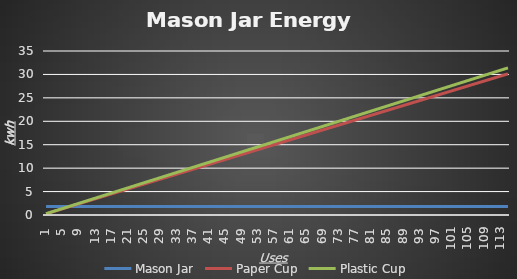
| Category | Mason Jar | Paper Cup | Plastic Cup |
|---|---|---|---|
| 1.0 | 1.81 | 0.262 | 0.273 |
| 2.0 | 1.81 | 0.524 | 0.546 |
| 3.0 | 1.81 | 0.786 | 0.819 |
| 4.0 | 1.81 | 1.048 | 1.092 |
| 5.0 | 1.81 | 1.31 | 1.365 |
| 6.0 | 1.81 | 1.572 | 1.638 |
| 7.0 | 1.81 | 1.834 | 1.911 |
| 8.0 | 1.81 | 2.096 | 2.184 |
| 9.0 | 1.81 | 2.358 | 2.457 |
| 10.0 | 1.81 | 2.62 | 2.73 |
| 11.0 | 1.81 | 2.882 | 3.003 |
| 12.0 | 1.81 | 3.144 | 3.276 |
| 13.0 | 1.81 | 3.406 | 3.549 |
| 14.0 | 1.81 | 3.668 | 3.822 |
| 15.0 | 1.81 | 3.93 | 4.095 |
| 16.0 | 1.81 | 4.192 | 4.368 |
| 17.0 | 1.81 | 4.454 | 4.641 |
| 18.0 | 1.81 | 4.716 | 4.914 |
| 19.0 | 1.81 | 4.978 | 5.187 |
| 20.0 | 1.81 | 5.24 | 5.46 |
| 21.0 | 1.81 | 5.502 | 5.733 |
| 22.0 | 1.81 | 5.764 | 6.006 |
| 23.0 | 1.81 | 6.026 | 6.279 |
| 24.0 | 1.81 | 6.288 | 6.552 |
| 25.0 | 1.81 | 6.55 | 6.825 |
| 26.0 | 1.81 | 6.812 | 7.098 |
| 27.0 | 1.81 | 7.074 | 7.371 |
| 28.0 | 1.81 | 7.336 | 7.644 |
| 29.0 | 1.81 | 7.598 | 7.917 |
| 30.0 | 1.81 | 7.86 | 8.19 |
| 31.0 | 1.81 | 8.122 | 8.463 |
| 32.0 | 1.81 | 8.384 | 8.736 |
| 33.0 | 1.81 | 8.646 | 9.009 |
| 34.0 | 1.81 | 8.908 | 9.282 |
| 35.0 | 1.81 | 9.17 | 9.555 |
| 36.0 | 1.81 | 9.432 | 9.828 |
| 37.0 | 1.81 | 9.694 | 10.101 |
| 38.0 | 1.81 | 9.956 | 10.374 |
| 39.0 | 1.81 | 10.218 | 10.647 |
| 40.0 | 1.81 | 10.48 | 10.92 |
| 41.0 | 1.81 | 10.742 | 11.193 |
| 42.0 | 1.81 | 11.004 | 11.466 |
| 43.0 | 1.81 | 11.266 | 11.739 |
| 44.0 | 1.81 | 11.528 | 12.012 |
| 45.0 | 1.81 | 11.79 | 12.285 |
| 46.0 | 1.81 | 12.052 | 12.558 |
| 47.0 | 1.81 | 12.314 | 12.831 |
| 48.0 | 1.81 | 12.576 | 13.104 |
| 49.0 | 1.81 | 12.838 | 13.377 |
| 50.0 | 1.81 | 13.1 | 13.65 |
| 51.0 | 1.81 | 13.362 | 13.923 |
| 52.0 | 1.81 | 13.624 | 14.196 |
| 53.0 | 1.81 | 13.886 | 14.469 |
| 54.0 | 1.81 | 14.148 | 14.742 |
| 55.0 | 1.81 | 14.41 | 15.015 |
| 56.0 | 1.81 | 14.672 | 15.288 |
| 57.0 | 1.81 | 14.934 | 15.561 |
| 58.0 | 1.81 | 15.196 | 15.834 |
| 59.0 | 1.81 | 15.458 | 16.107 |
| 60.0 | 1.81 | 15.72 | 16.38 |
| 61.0 | 1.81 | 15.982 | 16.653 |
| 62.0 | 1.81 | 16.244 | 16.926 |
| 63.0 | 1.81 | 16.506 | 17.199 |
| 64.0 | 1.81 | 16.768 | 17.472 |
| 65.0 | 1.81 | 17.03 | 17.745 |
| 66.0 | 1.81 | 17.292 | 18.018 |
| 67.0 | 1.81 | 17.554 | 18.291 |
| 68.0 | 1.81 | 17.816 | 18.564 |
| 69.0 | 1.81 | 18.078 | 18.837 |
| 70.0 | 1.81 | 18.34 | 19.11 |
| 71.0 | 1.81 | 18.602 | 19.383 |
| 72.0 | 1.81 | 18.864 | 19.656 |
| 73.0 | 1.81 | 19.126 | 19.929 |
| 74.0 | 1.81 | 19.388 | 20.202 |
| 75.0 | 1.81 | 19.65 | 20.475 |
| 76.0 | 1.81 | 19.912 | 20.748 |
| 77.0 | 1.81 | 20.174 | 21.021 |
| 78.0 | 1.81 | 20.436 | 21.294 |
| 79.0 | 1.81 | 20.698 | 21.567 |
| 80.0 | 1.81 | 20.96 | 21.84 |
| 81.0 | 1.81 | 21.222 | 22.113 |
| 82.0 | 1.81 | 21.484 | 22.386 |
| 83.0 | 1.81 | 21.746 | 22.659 |
| 84.0 | 1.81 | 22.008 | 22.932 |
| 85.0 | 1.81 | 22.27 | 23.205 |
| 86.0 | 1.81 | 22.532 | 23.478 |
| 87.0 | 1.81 | 22.794 | 23.751 |
| 88.0 | 1.81 | 23.056 | 24.024 |
| 89.0 | 1.81 | 23.318 | 24.297 |
| 90.0 | 1.81 | 23.58 | 24.57 |
| 91.0 | 1.81 | 23.842 | 24.843 |
| 92.0 | 1.81 | 24.104 | 25.116 |
| 93.0 | 1.81 | 24.366 | 25.389 |
| 94.0 | 1.81 | 24.628 | 25.662 |
| 95.0 | 1.81 | 24.89 | 25.935 |
| 96.0 | 1.81 | 25.152 | 26.208 |
| 97.0 | 1.81 | 25.414 | 26.481 |
| 98.0 | 1.81 | 25.676 | 26.754 |
| 99.0 | 1.81 | 25.938 | 27.027 |
| 100.0 | 1.81 | 26.2 | 27.3 |
| 101.0 | 1.81 | 26.462 | 27.573 |
| 102.0 | 1.81 | 26.724 | 27.846 |
| 103.0 | 1.81 | 26.986 | 28.119 |
| 104.0 | 1.81 | 27.248 | 28.392 |
| 105.0 | 1.81 | 27.51 | 28.665 |
| 106.0 | 1.81 | 27.772 | 28.938 |
| 107.0 | 1.81 | 28.034 | 29.211 |
| 108.0 | 1.81 | 28.296 | 29.484 |
| 109.0 | 1.81 | 28.558 | 29.757 |
| 110.0 | 1.81 | 28.82 | 30.03 |
| 111.0 | 1.81 | 29.082 | 30.303 |
| 112.0 | 1.81 | 29.344 | 30.576 |
| 113.0 | 1.81 | 29.606 | 30.849 |
| 114.0 | 1.81 | 29.868 | 31.122 |
| 115.0 | 1.81 | 30.13 | 31.395 |